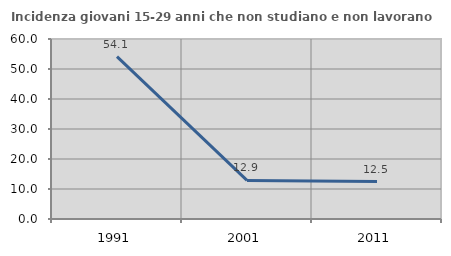
| Category | Incidenza giovani 15-29 anni che non studiano e non lavorano  |
|---|---|
| 1991.0 | 54.121 |
| 2001.0 | 12.874 |
| 2011.0 | 12.477 |